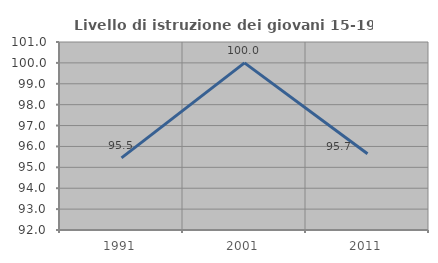
| Category | Livello di istruzione dei giovani 15-19 anni |
|---|---|
| 1991.0 | 95.455 |
| 2001.0 | 100 |
| 2011.0 | 95.652 |